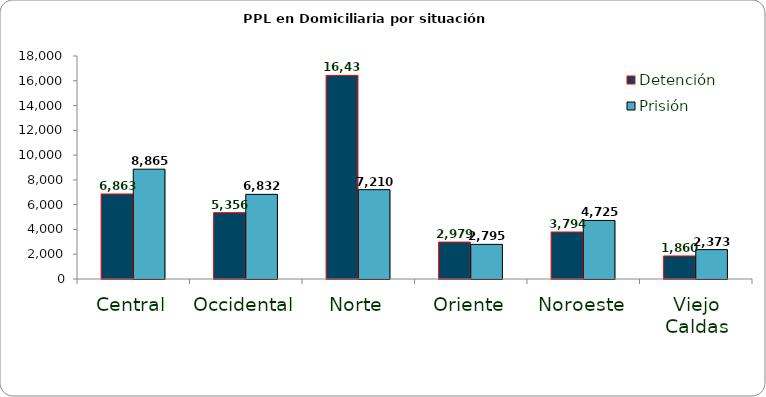
| Category | Detención | Prisión |
|---|---|---|
| Central | 6863 | 8865 |
| Occidental | 5356 | 6832 |
| Norte | 16432 | 7210 |
| Oriente | 2979 | 2795 |
| Noroeste | 3794 | 4725 |
| Viejo Caldas | 1860 | 2373 |